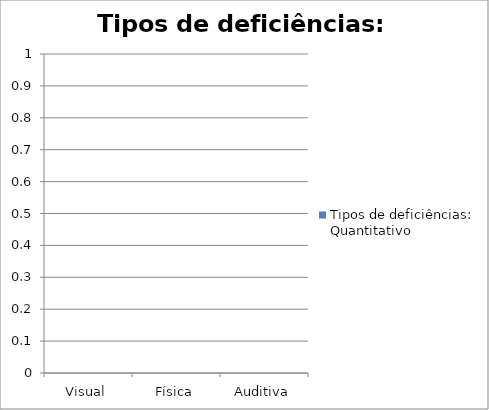
| Category | Tipos de deficiências: Quantitativo |
|---|---|
| Visual | 0 |
| Física | 0 |
| Auditiva | 0 |